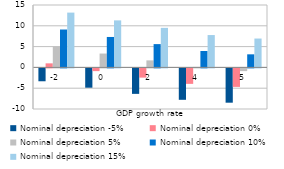
| Category | Nominal depreciation -5% | Nominal depreciation 0% | Nominal depreciation 5% | Nominal depreciation 10% | Nominal depreciation 15% |
|---|---|---|---|---|---|
| -2.0 | -3.092 | 0.974 | 5.04 | 9.106 | 13.172 |
| 0.0 | -4.638 | -0.653 | 3.332 | 7.317 | 11.302 |
| 2.0 | -6.122 | -2.215 | 1.691 | 5.598 | 9.505 |
| 4.0 | -7.55 | -3.718 | 0.114 | 3.945 | 7.777 |
| 5.0 | -8.243 | -4.448 | -0.653 | 3.142 | 6.938 |